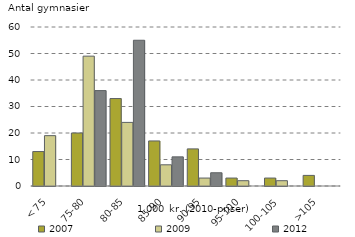
| Category | 2007 | 2009 | 2012 |
|---|---|---|---|
| < 75 | 13 | 19 | 0 |
| 75-80 | 20 | 49 | 36 |
| 80-85 | 33 | 24 | 55 |
| 85-90 | 17 | 8 | 11 |
| 90-95 | 14 | 3 | 5 |
| 95-100 | 3 | 2 | 0 |
| 100-105 | 3 | 2 | 0 |
| >105 | 4 | 0 | 0 |